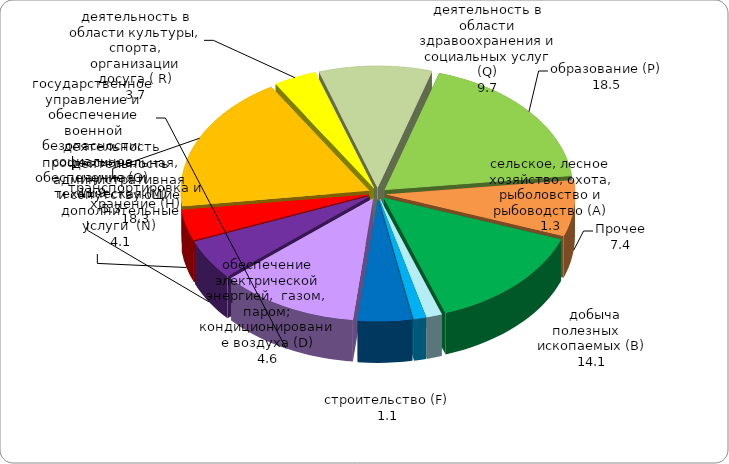
| Category | Series 3 | Series 2 | Series 1 | Series 0 |
|---|---|---|---|---|
|     добыча   полезных    ископаемых (В) | 14.147 |  |  |  |
| сельское, лесное хозяйство, охота, рыболовство и рыбоводство (А) | 1.319 |  |  |  |
| строительство (F) | 1.055 |  |  |  |
| обеспечение электрической энергией,  газом, паром; кондиционирование воздуха (D) | 4.646 |  |  |  |
| государственное управление и обеспечение военной безопасности; социальное обеспечение (О) | 11.9 |  |  |  |
| деятельность профессиональная, научная и техническая (М) | 5.3 |  |  |  |
| деятельность административная и сопутствующие дополнительные услуги  (N) | 4.072 |  |  |  |
| транспортировка и хранение (H) | 18.3 |  |  |  |
| деятельность в области культуры, спорта, организации досуга ( R) | 3.684 |  |  |  |
| деятельность в области здравоохранения и социальных услуг (Q) | 9.7 |  |  |  |
| образование (Р) | 18.483 |  |  |  |
| Прочее | 7.407 |  |  |  |